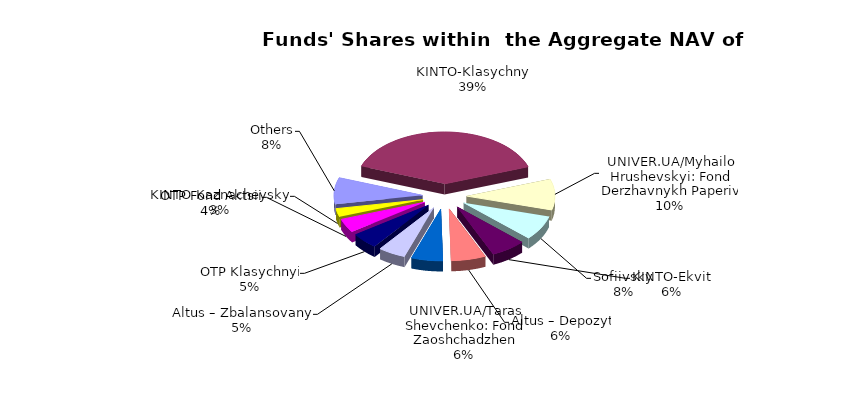
| Category | Series 0 | Series 1 |
|---|---|---|
| Others | 4600036.8 | 0.079 |
| KINTO-Klasychnyi | 21672189.09 | 0.373 |
| UNIVER.UA/Myhailo Hrushevskyi: Fond Derzhavnykh Paperiv | 5360076.17 | 0.092 |
| Sofiivskyi | 4206591.946 | 0.072 |
| KINTO-Ekviti | 3554497.22 | 0.061 |
| Altus – Depozyt | 3494833.76 | 0.06 |
| UNIVER.UA/Taras Shevchenko: Fond Zaoshchadzhen | 3190402.44 | 0.055 |
| Altus – Zbalansovanyi | 2775622.95 | 0.048 |
| ОТP Klasychnyi | 2755855.62 | 0.047 |
| OTP Fond Aktsii | 2349808.86 | 0.04 |
| KINTO-Kaznacheyskyi | 1442580.64 | 0.025 |